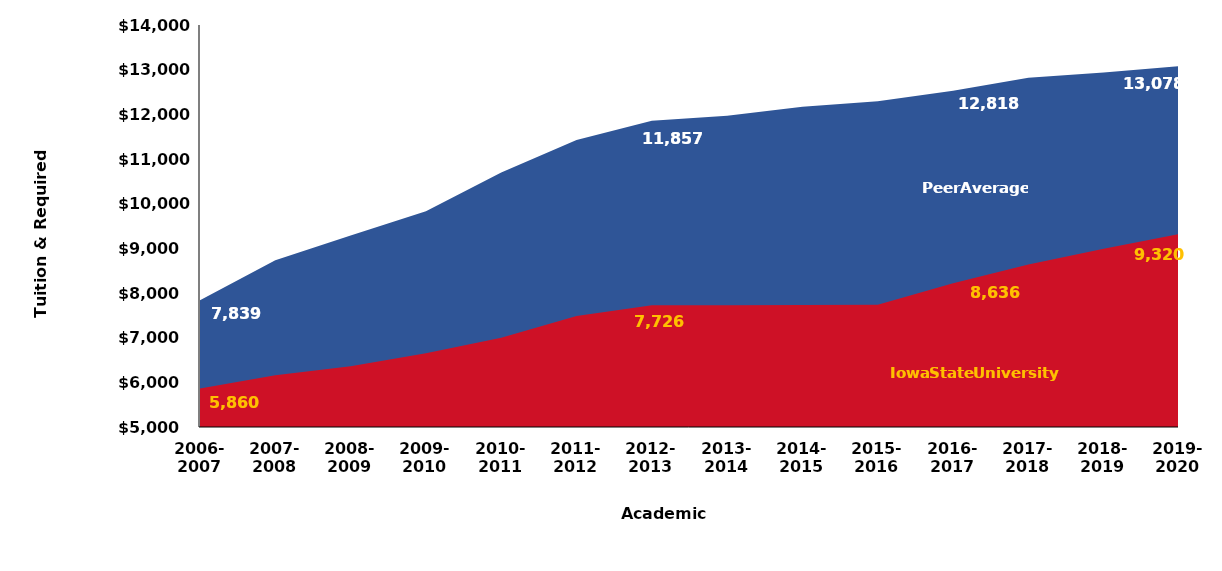
| Category | Peer Average | Iowa State University |
|---|---|---|
| 2006-
2007 | 7839.415 | 5860 |
| 2007-
2008 | 8734.088 | 6161.32 |
| 2008-
2009 | 9289.001 | 6360 |
| 2009-
2010 | 9830.583 | 6651 |
| 2010-
2011 | 10698.1 | 6997 |
| 2011-
2012 | 11423.4 | 7486 |
| 2012-
2013 | 11856.7 | 7726 |
| 2013-
2014 | 11970.78 | 7726 |
| 2014-
2015 | 12168.48 | 7731.4 |
| 2015-
2016 | 12290.456 | 7735.9 |
| 2016-
2017 | 12528.628 | 8219.4 |
| 2017-
2018 | 12817.8 | 8635.9 |
| 2018-
2019 | 12935.492 | 8988.4 |
| 2019-
2020 | 13077.572 | 9319.9 |